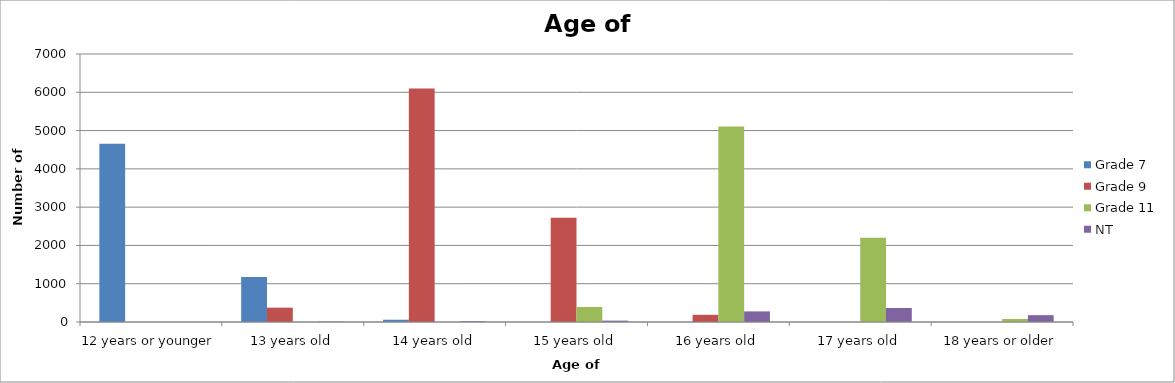
| Category | Grade 7 | Grade 9 | Grade 11 | NT |
|---|---|---|---|---|
| 12 years or younger | 4655.47 | 0 | 0 | 0 |
| 13 years old | 1178.6 | 375.16 | 0 | 8.93 |
| 14 years old | 58.93 | 6096.35 | 0 | 17.86 |
| 15 years old | 0 | 2719.91 | 392.85 | 35.72 |
| 16 years old | 0 | 187.58 | 5107.05 | 276.83 |
| 17 years old | 0 | 0 | 2199.96 | 366.13 |
| 18 years or older | 0 | 0 | 78.57 | 178.6 |